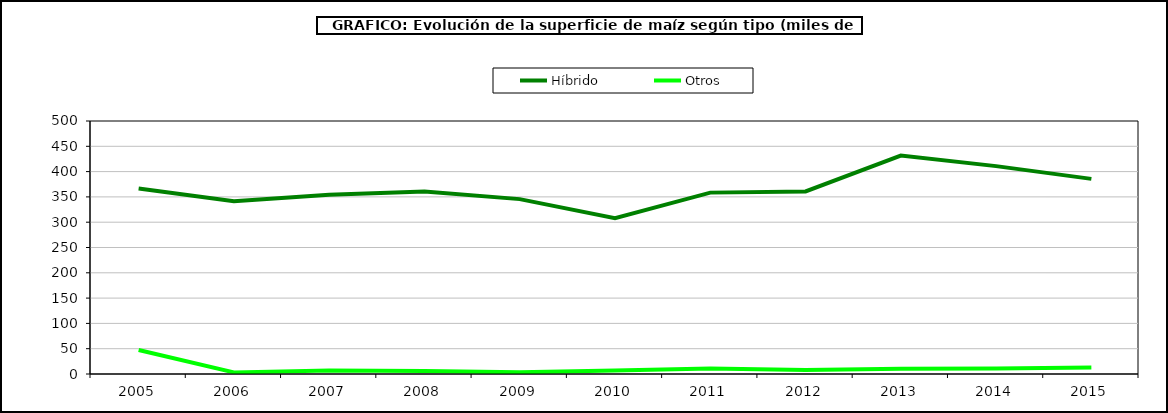
| Category | Híbrido | Otros |
|---|---|---|
| 2005.0 | 366.766 | 47.532 |
| 2006.0 | 341.193 | 3.207 |
| 2007.0 | 354.133 | 6.865 |
| 2008.0 | 360.764 | 5.72 |
| 2009.0 | 345.605 | 3.344 |
| 2010.0 | 307.927 | 7.063 |
| 2011.0 | 358.45 | 10.814 |
| 2012.0 | 360.837 | 7.917 |
| 2013.0 | 431.742 | 10.556 |
| 2014.0 | 410.83 | 10.775 |
| 2015.0 | 385.617 | 12.64 |